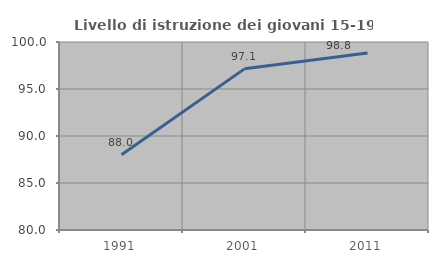
| Category | Livello di istruzione dei giovani 15-19 anni |
|---|---|
| 1991.0 | 88.013 |
| 2001.0 | 97.143 |
| 2011.0 | 98.831 |